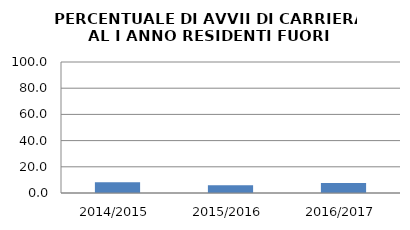
| Category | 2014/2015 2015/2016 2016/2017 |
|---|---|
| 2014/2015 | 8.147 |
| 2015/2016 | 5.952 |
| 2016/2017 | 7.643 |